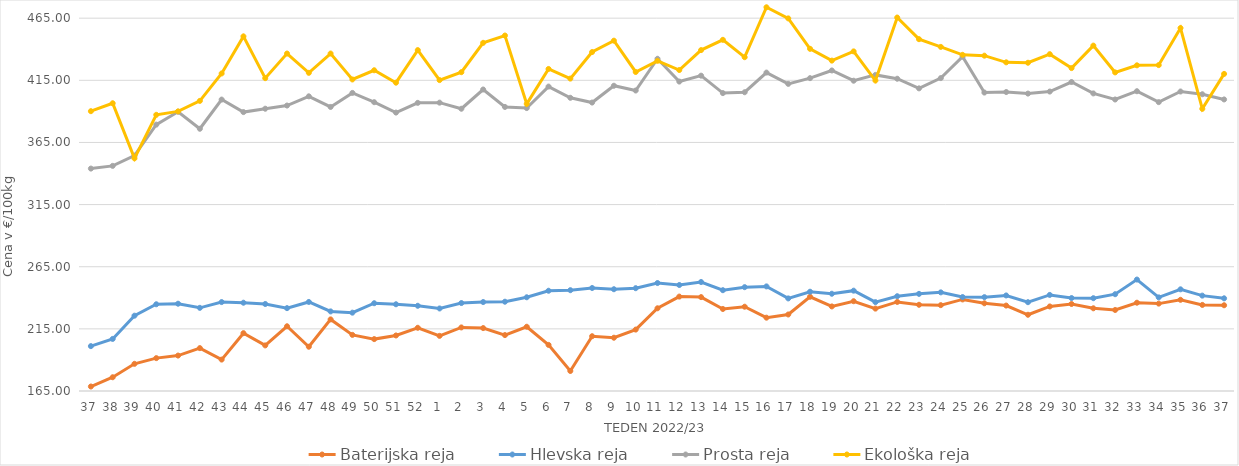
| Category | Baterijska reja | Hlevska reja | Prosta reja | Ekološka reja |
|---|---|---|---|---|
| 37.0 | 168.61 | 201.11 | 343.97 | 390.17 |
| 38.0 | 176.07 | 206.91 | 346.16 | 396.55 |
| 39.0 | 186.86 | 225.6 | 354.41 | 352.24 |
| 40.0 | 191.45 | 234.79 | 379.35 | 387.24 |
| 41.0 | 193.52 | 235.24 | 389.75 | 390 |
| 42.0 | 199.51 | 231.92 | 376.02 | 398.45 |
| 43.0 | 190.28 | 236.56 | 399.51 | 420.52 |
| 44.0 | 211.53 | 236.04 | 389.44 | 450.35 |
| 45.0 | 201.69 | 235.01 | 392.15 | 416.72 |
| 46.0 | 217.08 | 231.68 | 394.71 | 436.55 |
| 47.0 | 200.62 | 236.65 | 402.12 | 421.03 |
| 48.0 | 222.61 | 229.05 | 393.56 | 436.55 |
| 49.0 | 210.16 | 228.03 | 404.87 | 415.69 |
| 50.0 | 206.76 | 235.63 | 397.4 | 423.1 |
| 51.0 | 209.69 | 234.79 | 389.05 | 413.1 |
| 52.0 | 215.87 | 233.58 | 396.87 | 439.31 |
| 1.0 | 209.37 | 231.41 | 397.04 | 415.17 |
| 2.0 | 216.15 | 235.78 | 392.13 | 421.55 |
| 3.0 | 215.63 | 236.58 | 407.61 | 445.17 |
| 4.0 | 210 | 236.85 | 393.58 | 451.04 |
| 5.0 | 216.7 | 240.42 | 392.67 | 396.03 |
| 6.0 | 202.1 | 245.67 | 409.97 | 424.14 |
| 7.0 | 181.11 | 246.12 | 400.94 | 416.38 |
| 8.0 | 209.08 | 247.88 | 397.11 | 437.76 |
| 9.0 | 207.87 | 246.89 | 410.64 | 446.9 |
| 10.0 | 214.42 | 247.73 | 406.8 | 421.72 |
| 11.0 | 231.56 | 251.88 | 432.34 | 430.69 |
| 12.0 | 240.97 | 250.3 | 414 | 423.28 |
| 13.0 | 240.55 | 252.7 | 418.74 | 439.31 |
| 14.0 | 230.99 | 246.12 | 404.72 | 447.59 |
| 15.0 | 232.82 | 248.56 | 405.42 | 433.62 |
| 16.0 | 224 | 249.17 | 421.22 | 473.79 |
| 17.0 | 226.57 | 239.5 | 412.13 | 464.83 |
| 18.0 | 240.83 | 244.89 | 416.74 | 440.35 |
| 19.0 | 233.05 | 243.26 | 422.93 | 430.86 |
| 20.0 | 237.25 | 245.73 | 414.68 | 438.28 |
| 21.0 | 231.3 | 236.5 | 419.36 | 414.83 |
| 22.0 | 236.67 | 241.27 | 416.27 | 465.52 |
| 23.0 | 234.39 | 243.16 | 408.53 | 448.1 |
| 24.0 | 234.08 | 244.37 | 416.78 | 441.9 |
| 25.0 | 238.69 | 240.6 | 434.05 | 435.52 |
| 26.0 | 235.57 | 240.51 | 405.15 | 434.83 |
| 27.0 | 233.75 | 241.89 | 405.58 | 429.48 |
| 28.0 | 226.35 | 236.46 | 404.32 | 429.14 |
| 29.0 | 233.03 | 242.31 | 405.96 | 436.04 |
| 30.0 | 235 | 239.8 | 413.63 | 424.83 |
| 31.0 | 231.55 | 239.67 | 404.46 | 442.93 |
| 32.0 | 230.2 | 242.89 | 399.57 | 421.38 |
| 33.0 | 236.04 | 254.68 | 406.23 | 427.07 |
| 34.0 | 235.32 | 240.35 | 397.45 | 427.24 |
| 35.0 | 238.39 | 246.82 | 406 | 457.07 |
| 36.0 | 234.27 | 241.75 | 403.79 | 392.07 |
| 37.0 | 234 | 239.58 | 399.61 | 420.17 |